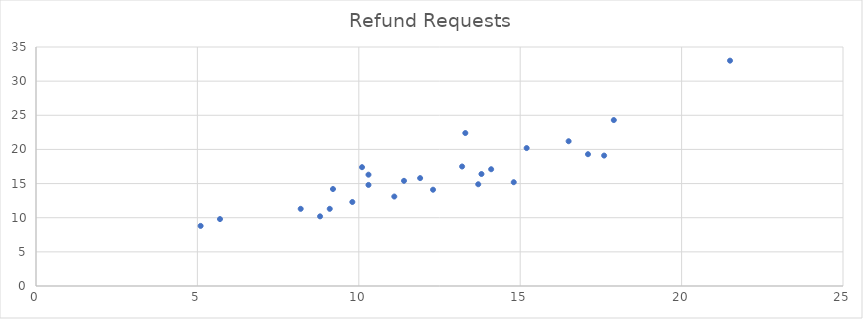
| Category | Refund Requests |
|---|---|
| 9.8 | 12.3 |
| 8.2 | 11.3 |
| 16.5 | 21.2 |
| 11.4 | 15.4 |
| 17.9 | 24.3 |
| 5.1 | 8.8 |
| 21.5 | 33 |
| 10.1 | 17.4 |
| 13.7 | 14.9 |
| 14.1 | 17.1 |
| 17.6 | 19.1 |
| 5.7 | 9.8 |
| 10.3 | 16.3 |
| 11.1 | 13.1 |
| 14.8 | 15.2 |
| 15.2 | 20.2 |
| 9.1 | 11.3 |
| 13.3 | 22.4 |
| 17.1 | 19.3 |
| 13.2 | 17.5 |
| 8.8 | 10.2 |
| 9.2 | 14.2 |
| 11.9 | 15.8 |
| 13.8 | 16.4 |
| 10.3 | 14.8 |
| 12.3 | 14.1 |